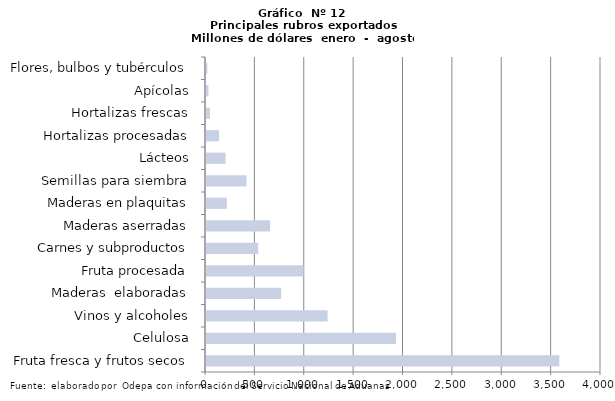
| Category | Series 7 |
|---|---|
| Fruta fresca y frutos secos | 3577993.54 |
| Celulosa | 1924200.626 |
| Vinos y alcoholes | 1231557.444 |
| Maderas  elaboradas | 761909.964 |
| Fruta procesada | 987741.794 |
| Carnes y subproductos | 528826.221 |
| Maderas aserradas | 649606.496 |
| Maderas en plaquitas | 211001.16 |
| Semillas para siembra | 410960.21 |
| Lácteos | 198446.323 |
| Hortalizas procesadas | 132325.179 |
| Hortalizas frescas | 39836.372 |
| Apícolas | 24486.311 |
| Flores, bulbos y tubérculos | 13690.243 |